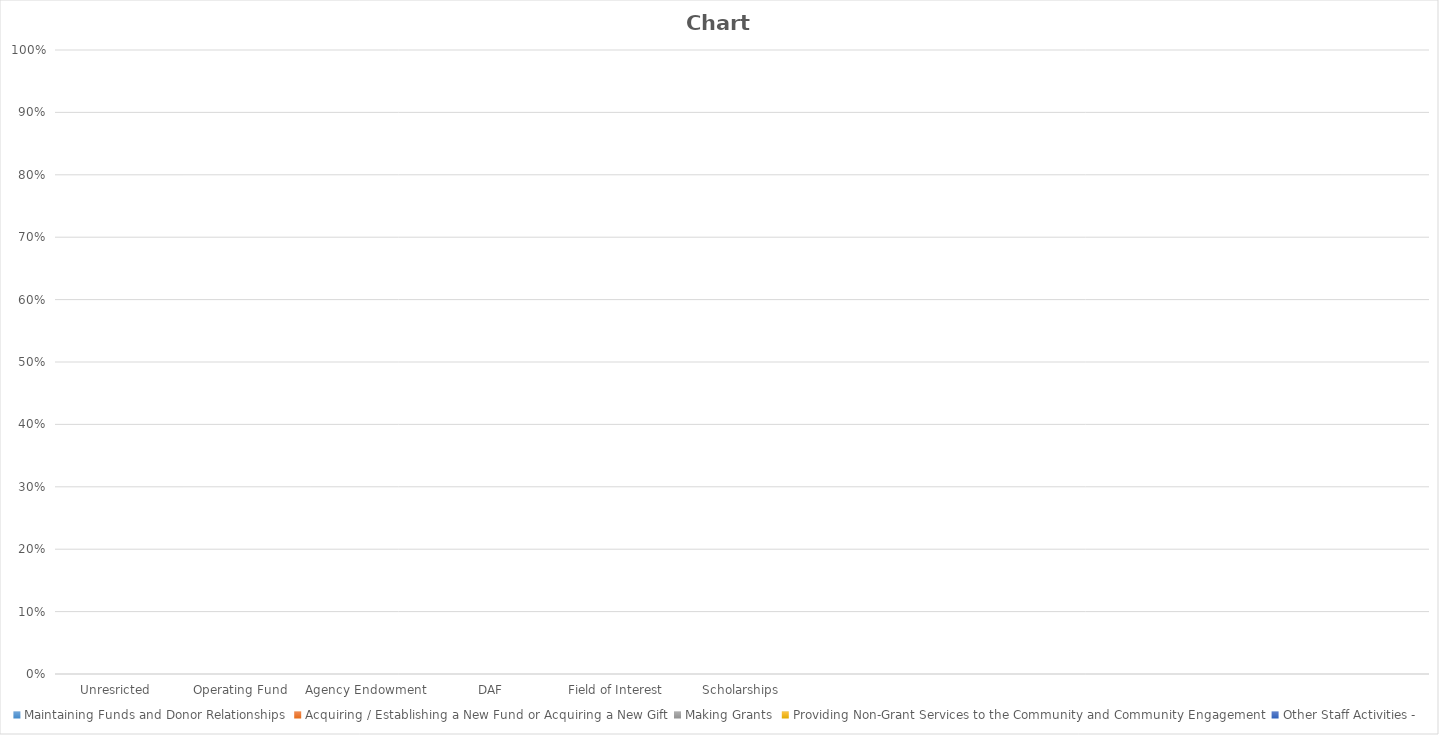
| Category | Maintaining Funds and Donor Relationships | Acquiring / Establishing a New Fund or Acquiring a New Gift | Making Grants | Providing Non-Grant Services to the Community and Community Engagement | Other Staff Activities -  |
|---|---|---|---|---|---|
| Unresricted | 0 | 0 | 0 | 0 | 0 |
| Operating Fund | 0 | 0 | 0 | 0 | 0 |
| Agency Endowment | 0 | 0 | 0 | 0 | 0 |
| DAF | 0 | 0 | 0 | 0 | 0 |
| Field of Interest | 0 | 0 | 0 | 0 | 0 |
| Scholarships | 0 | 0 | 0 | 0 | 0 |